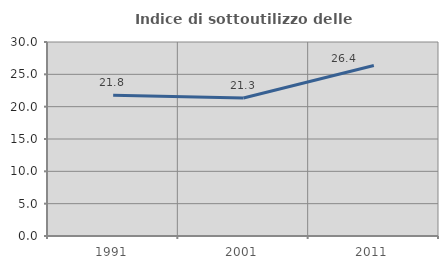
| Category | Indice di sottoutilizzo delle abitazioni  |
|---|---|
| 1991.0 | 21.767 |
| 2001.0 | 21.345 |
| 2011.0 | 26.374 |